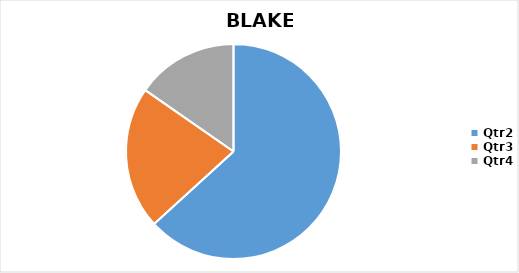
| Category | BLAKE |
|---|---|
| Qtr2 | 4137 |
| Qtr3 | 1403 |
| Qtr4 | 1003 |